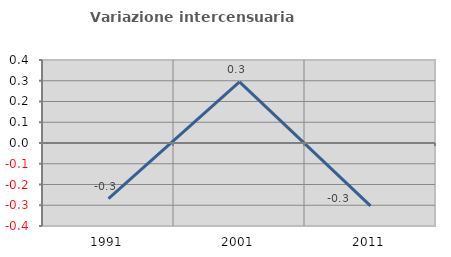
| Category | Variazione intercensuaria annua |
|---|---|
| 1991.0 | -0.268 |
| 2001.0 | 0.295 |
| 2011.0 | -0.303 |